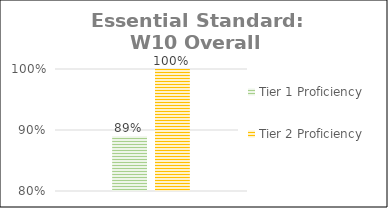
| Category | Tier 1 Proficiency | Tier 2 Proficiency |
|---|---|---|
| 0 | 0.89 | 1 |